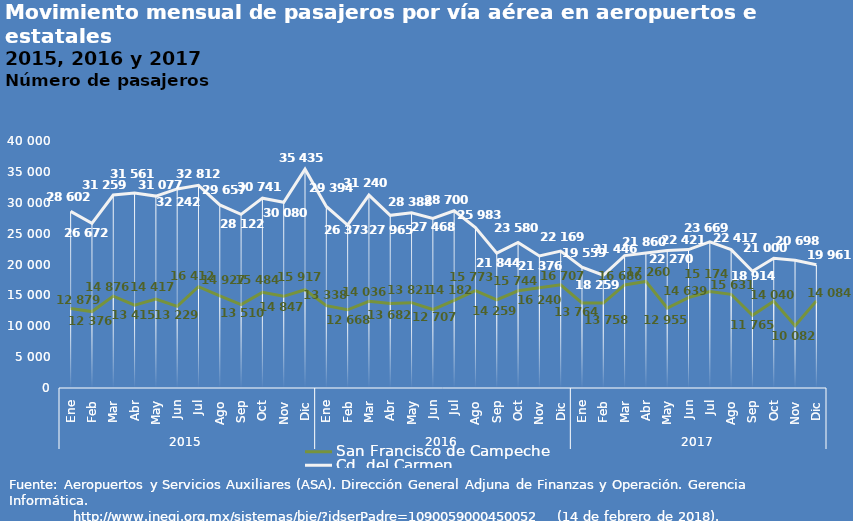
| Category | San Francisco de Campeche | Cd. del Carmen  |
|---|---|---|
| 0 | 12879 | 28602 |
| 1 | 12376 | 26672 |
| 2 | 14876 | 31259 |
| 3 | 13415 | 31561 |
| 4 | 14417 | 31077 |
| 5 | 13229 | 32242 |
| 6 | 16412 | 32812 |
| 7 | 14927 | 29657 |
| 8 | 13510 | 28122 |
| 9 | 15484 | 30741 |
| 10 | 14847 | 30080 |
| 11 | 15917 | 35435 |
| 12 | 13338 | 29394 |
| 13 | 12668 | 26373 |
| 14 | 14036 | 31240 |
| 15 | 13682 | 27965 |
| 16 | 13821 | 28388 |
| 17 | 12707 | 27468 |
| 18 | 14182 | 28700 |
| 19 | 15773 | 25983 |
| 20 | 14259 | 21844 |
| 21 | 15744 | 23580 |
| 22 | 16240 | 21376 |
| 23 | 16707 | 22169 |
| 24 | 13764 | 19559 |
| 25 | 13758 | 18259 |
| 26 | 16686 | 21446 |
| 27 | 17260 | 21860 |
| 28 | 12955 | 22270 |
| 29 | 14639 | 22421 |
| 30 | 15631 | 23669 |
| 31 | 15174 | 22417 |
| 32 | 11765 | 18914 |
| 33 | 14040 | 21000 |
| 34 | 10082 | 20698 |
| 35 | 14084 | 19961 |